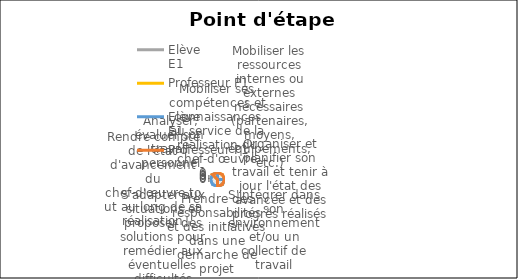
| Category | Elève 
E1 | Professeur P1 |
|---|---|---|
| Mobiliser ses compétences et connaissances au service de la réalisation du chef-d'œuvre | 1 | 1 |
| Mobiliser les ressources internes ou externes nécessaires (partenaires, moyens, équipements, etc.) | 0 | 1 |
| Organiser et planifier son travail et tenir à jour l'état des avancée et des progrès réalisés | 1 | 1 |
| S'intégrer dans son environnement et/ou un collectif de travail | 1 | 1 |
| Prendre des responsabilités et des initiatives dans une démarche de projet | 1 | 1 |
| S'adapter aux situations et proposer des solutions pour remédier aux éventuelles difficultés rencontrées | 1 | 0 |
| Rendre compte de l'état d'avancement du chef-d'œuvre tout au long de sa réalisation | 1 | 0 |
| Analyser, évaluer son travail personnel | 1 | 1 |